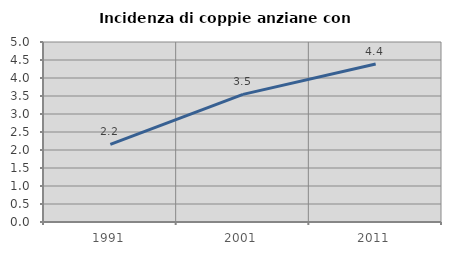
| Category | Incidenza di coppie anziane con figli |
|---|---|
| 1991.0 | 2.155 |
| 2001.0 | 3.545 |
| 2011.0 | 4.39 |